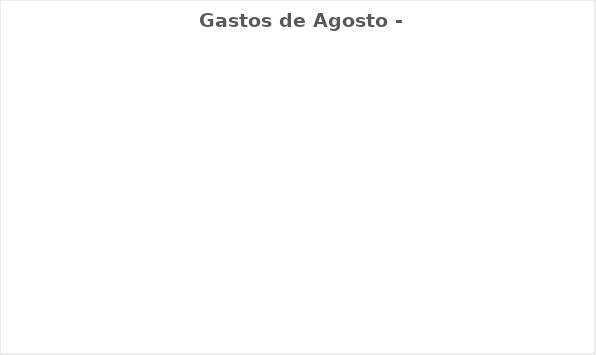
| Category | Gastos de Agosto - Real |
|---|---|
| Despesas Mensais | 0 |
| Aposentadoria/Pagar à si | 0 |
| Gratidão/ Doação/ Dizimo | 0 |
| Desejos | 0 |
| Dívidas/Investimentos | 0 |